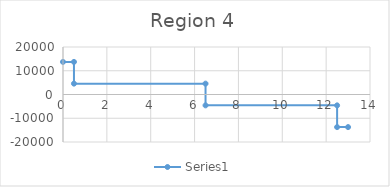
| Category | Series 0 |
|---|---|
| 0.0 | 13722.774 |
| 0.5 | 13722.774 |
| 0.5 | 4574.258 |
| 6.5 | 4574.258 |
| 6.5 | -4574.258 |
| 12.5 | -4574.258 |
| 12.5 | -13722.774 |
| 13.0 | -13722.774 |